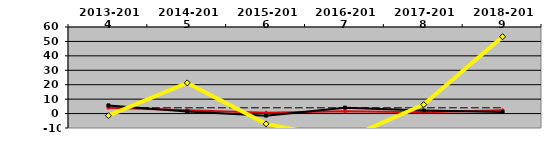
| Category | Baseline | WEST MEDIAN | NATIONAL MEDIAN | TEXAS LUTHERAN |
|---|---|---|---|---|
| 2013-2014 | 4 | 3.955 | 5.667 | -1.419 |
| 2014-2015 | 4 | 2.312 | 1.445 | 21.272 |
| 2015-2016 | 4 | 0.557 | -1.431 | -7.157 |
| 2016-2017 | 4 | 1.537 | 4.105 | -17.719 |
| 2017-2018 | 4 | 0.852 | 2.148 | 6.249 |
| 2018-2019 | 4 | 2.303 | 1.087 | 53.269 |